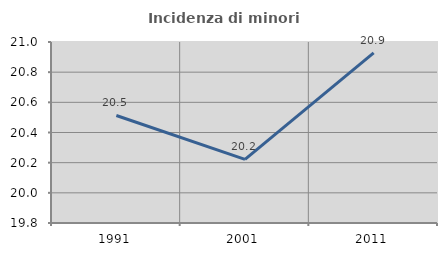
| Category | Incidenza di minori stranieri |
|---|---|
| 1991.0 | 20.513 |
| 2001.0 | 20.222 |
| 2011.0 | 20.927 |